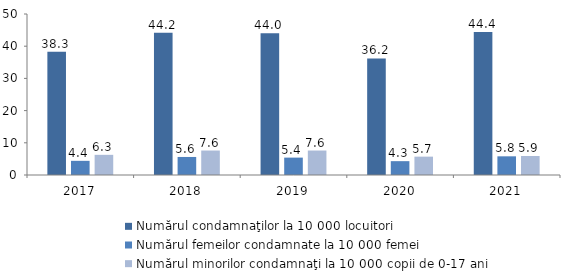
| Category | Numărul condamnaţilor la 10 000 locuitori | Numărul femeilor condamnate la 10 000 femei | Numărul minorilor condamnaţi la 10 000 copii de 0-17 ani |
|---|---|---|---|
| 2017.0 | 38.3 | 4.4 | 6.262 |
| 2018.0 | 44.2 | 5.6 | 7.6 |
| 2019.0 | 44 | 5.4 | 7.6 |
| 2020.0 | 36.2 | 4.3 | 5.7 |
| 2021.0 | 44.4 | 5.8 | 5.9 |